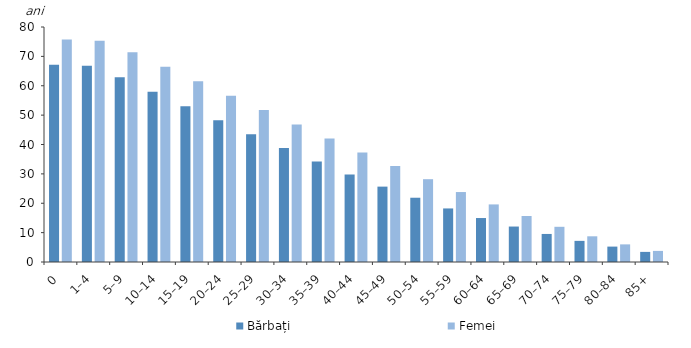
| Category | Bărbați | Femei |
|---|---|---|
| 0 | 67.125 | 75.715 |
| 1–4 | 66.777 | 75.352 |
| 5–9 | 62.883 | 71.411 |
| 10–14 | 57.943 | 66.458 |
| 15–19 | 53.034 | 61.5 |
| 20–24 | 48.232 | 56.604 |
| 25–29 | 43.498 | 51.715 |
| 30–34 | 38.816 | 46.837 |
| 35–39 | 34.242 | 42.038 |
| 40–44 | 29.802 | 37.305 |
| 45–49 | 25.66 | 32.704 |
| 50–54 | 21.879 | 28.19 |
| 55–59 | 18.233 | 23.815 |
| 60–64 | 14.969 | 19.603 |
| 65–69 | 12.071 | 15.666 |
| 70–74 | 9.548 | 11.983 |
| 75–79 | 7.193 | 8.751 |
| 80–84 | 5.243 | 5.999 |
| 85+ | 3.441 | 3.777 |